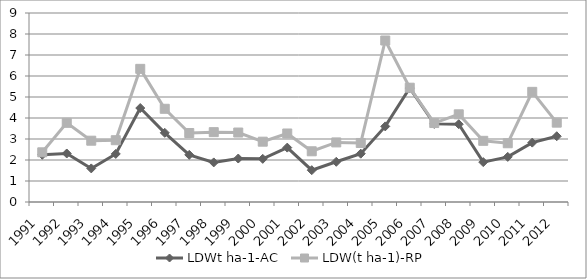
| Category | LDWt ha-1-AC | LDW(t ha-1)-RP |
|---|---|---|
| 1991.0 | 2.25 | 2.366 |
| 1992.0 | 2.31 | 3.77 |
| 1993.0 | 1.599 | 2.919 |
| 1994.0 | 2.289 | 2.942 |
| 1995.0 | 4.475 | 6.341 |
| 1996.0 | 3.295 | 4.438 |
| 1997.0 | 2.245 | 3.285 |
| 1998.0 | 1.885 | 3.326 |
| 1999.0 | 2.07 | 3.308 |
| 2000.0 | 2.055 | 2.872 |
| 2001.0 | 2.59 | 3.262 |
| 2002.0 | 1.515 | 2.415 |
| 2003.0 | 1.915 | 2.838 |
| 2004.0 | 2.3 | 2.811 |
| 2005.0 | 3.6 | 7.69 |
| 2006.0 | 5.426 | 5.442 |
| 2007.0 | 3.72 | 3.76 |
| 2008.0 | 3.705 | 4.175 |
| 2009.0 | 1.899 | 2.913 |
| 2010.0 | 2.149 | 2.797 |
| 2011.0 | 2.828 | 5.245 |
| 2012.0 | 3.131 | 3.779 |